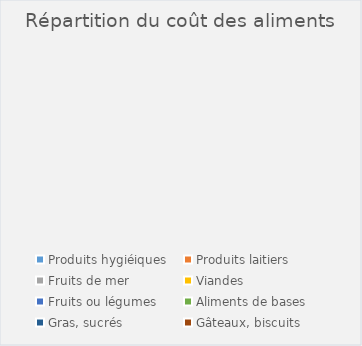
| Category | Series 0 |
|---|---|
| Produits hygiéiques | 0 |
| Produits laitiers | 0 |
| Fruits de mer | 0 |
| Viandes | 0 |
| Fruits ou légumes | 0 |
| Aliments de bases | 0 |
| Gras, sucrés | 0 |
| Gâteaux, biscuits | 0 |